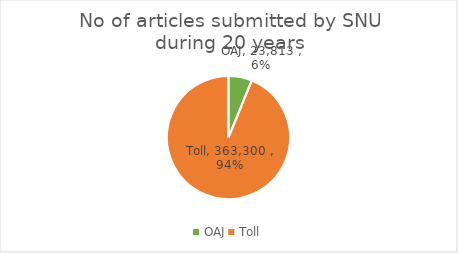
| Category | Series 0 |
|---|---|
| OAJ | 23813 |
| Toll | 363300 |